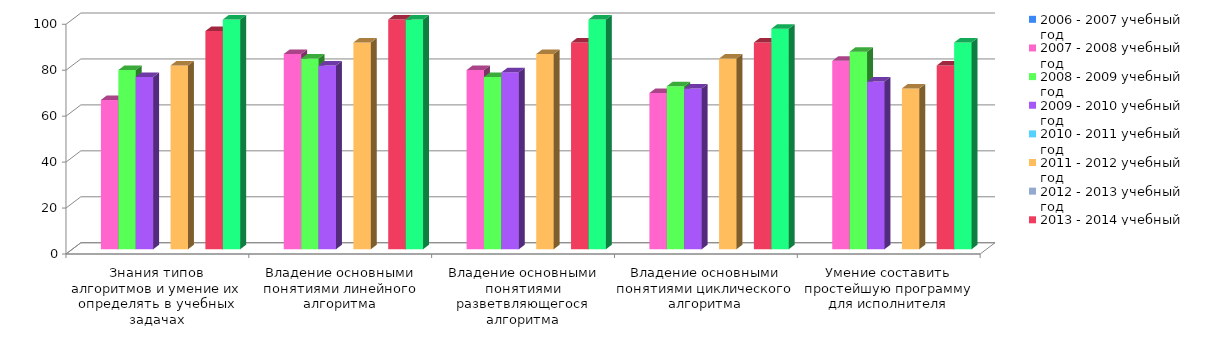
| Category | 2006 - 2007 учебный год | 2007 - 2008 учебный год | 2008 - 2009 учебный год | 2009 - 2010 учебный год | 2010 - 2011 учебный год | 2011 - 2012 учебный год | 2012 - 2013 учебный год | 2013 - 2014 учебный год | 2014 - 2015 учебный год |
|---|---|---|---|---|---|---|---|---|---|
| Знания типов алгоритмов и умение их определять в учебных задачах |  | 65 | 78 | 75 |  | 80 |  | 95 | 100 |
| Владение основными понятиями линейного алгоритма |  | 85 | 83 | 80 |  | 90 |  | 100 | 100 |
| Владение основными понятиями разветвляющегося алгоритма |  | 78 | 75 | 77 |  | 85 |  | 90 | 100 |
| Владение основными понятиями циклического алгоритма |  | 68 | 71 | 70 |  | 83 |  | 90 | 96 |
| Умение составить простейшую программу для исполнителя |  | 82 | 86 | 73 |  | 70 |  | 80 | 90 |